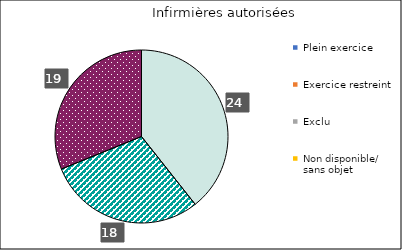
| Category | Infirmières autorisées | Infirmières praticiennes |
|---|---|---|
| Plein exercice | 24 | 0 |
| Exercice restreint | 18 | 0 |
| Exclu | 19 | 0 |
| Non disponible/
sans objet | 0 | 0 |